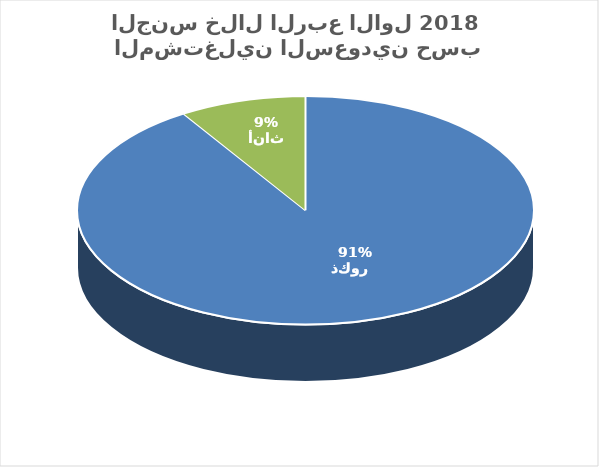
| Category | Series 0 |
|---|---|
| ذكور    | 1586037 |
| أناث | 155996 |